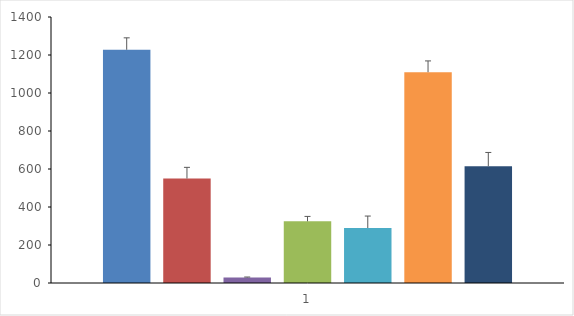
| Category | 5-HT(10-4 M) | TCB-2 (Agonista 5-HT2A) | BW723C86  (agonista 5-HT2B) | WAY161503 (agonista 5-HT2C) | MDL 100907 (Antagonista 5-HT2A) | RS 127445 (Antagonista 5-HT2B) | RS 10221 (Antagonista 5-HT2C) |
|---|---|---|---|---|---|---|---|
| 0 | 1227.485 | 549.69 | 28.753 | 324.626 | 289.452 | 1109.568 | 614.761 |